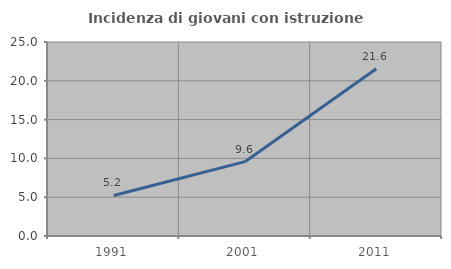
| Category | Incidenza di giovani con istruzione universitaria |
|---|---|
| 1991.0 | 5.229 |
| 2001.0 | 9.581 |
| 2011.0 | 21.553 |